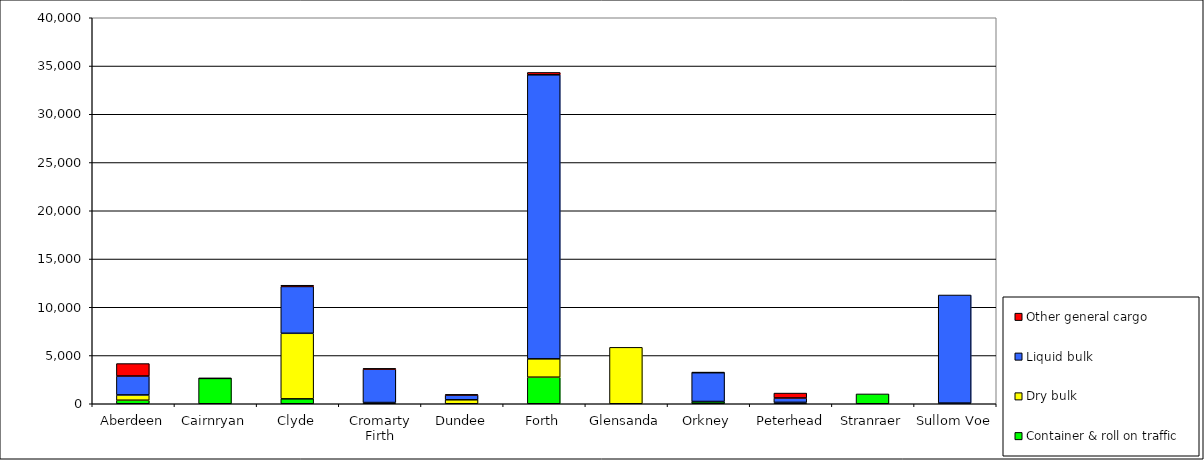
| Category | Container & roll on traffic | Dry bulk | Liquid bulk | Other general cargo |
|---|---|---|---|---|
| Aberdeen | 365 | 549 | 1957 | 1293 |
| Cairnryan | 2632 | 3 | 0 | 0 |
| Clyde | 509 | 6793 | 4853 | 128 |
| Cromarty Firth | 0 | 125 | 3460 | 78 |
| Dundee | 0 | 412 | 493 | 57 |
| Forth | 2751 | 1904 | 29432 | 249 |
| Glensanda | 0 | 5846 | 0 | 0 |
| Orkney | 213 | 20 | 2998 | 14 |
| Peterhead | 0 | 144 | 453 | 510 |
| Stranraer | 1017 | 0 | 0 | 0 |
| Sullom Voe | 0 | 69 | 11202 | 0 |